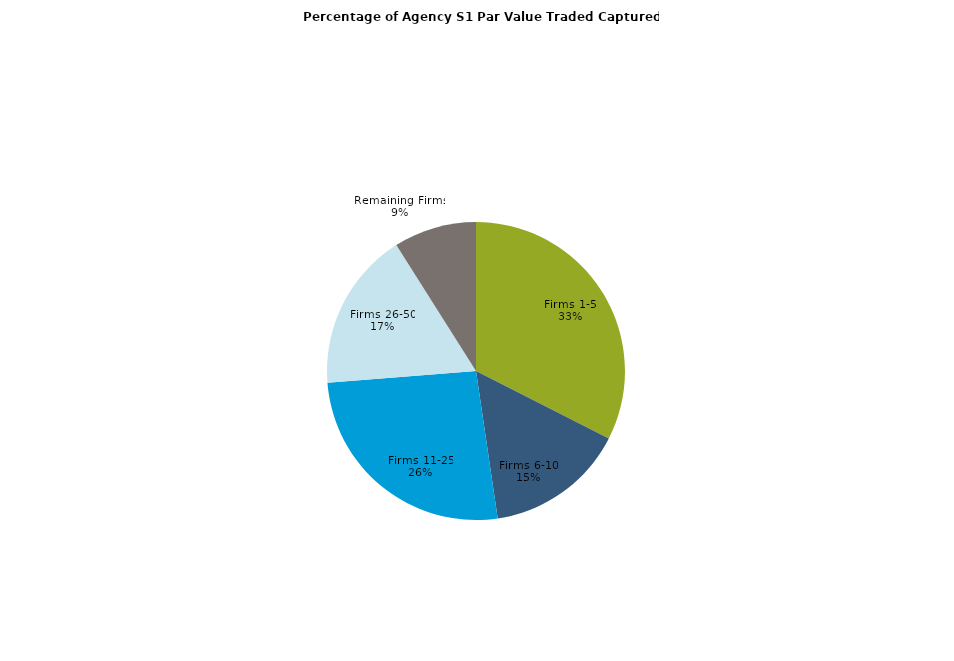
| Category | Series 0 |
|---|---|
| Firms 1-5 | 0.325 |
| Firms 6-10 | 0.152 |
| Firms 11-25 | 0.261 |
| Firms 26-50 | 0.173 |
| Remaining Firms | 0.09 |